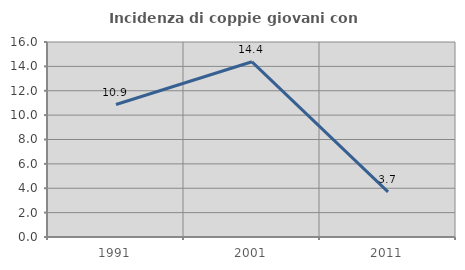
| Category | Incidenza di coppie giovani con figli |
|---|---|
| 1991.0 | 10.87 |
| 2001.0 | 14.375 |
| 2011.0 | 3.704 |